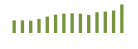
| Category | Saldo [ (1)-(2) ] |
|---|---|
| 0 | 203117.024 |
| 1 | 204244.864 |
| 2 | 198400.412 |
| 3 | 227324.117 |
| 4 | 264760.339 |
| 5 | 296419.004 |
| 6 | 312165.442 |
| 7 | 318321.614 |
| 8 | 312463.312 |
| 9 | 291587.274 |
| 10 | 334649.348 |
| 11 | 344816.778 |
| 12 | 363008.511 |
| 13 | 460327.444 |